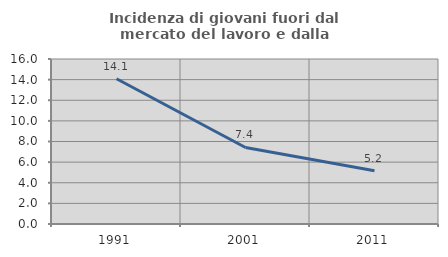
| Category | Incidenza di giovani fuori dal mercato del lavoro e dalla formazione  |
|---|---|
| 1991.0 | 14.089 |
| 2001.0 | 7.422 |
| 2011.0 | 5.169 |